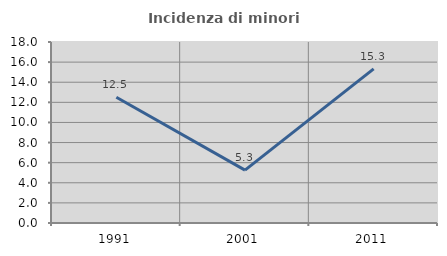
| Category | Incidenza di minori stranieri |
|---|---|
| 1991.0 | 12.5 |
| 2001.0 | 5.263 |
| 2011.0 | 15.328 |